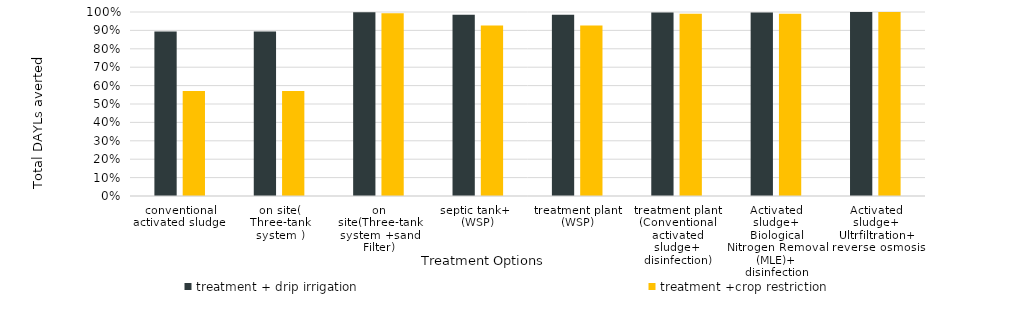
| Category | treatment + drip irrigation  | treatment +crop restriction  |
|---|---|---|
| conventional activated sludge  | 0.894 | 0.57 |
| on site( Three-tank system ) | 0.894 | 0.57 |
| on site(Three-tank system +sand Filter) | 0.999 | 0.993 |
| septic tank+   (WSP) | 0.985 | 0.926 |
| treatment plant  (WSP) | 0.985 | 0.926 |
| treatment plant (Conventional activated sludge+ disinfection) | 0.997 | 0.99 |
| Activated sludge+ Biological Nitrogen Removal (MLE)+ disinfection | 0.997 | 0.99 |
| Activated sludge+ Ultrfiltration+ reverse osmosis | 1 | 1 |